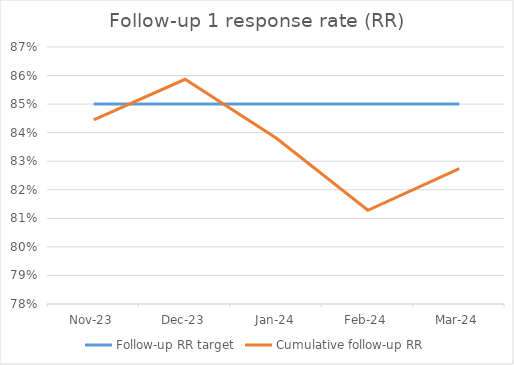
| Category | Follow-up RR target | Cumulative follow-up RR |
|---|---|---|
| Nov-23 | 0.85 | 0.844 |
| Dec-23 | 0.85 | 0.859 |
| Jan-24 | 0.85 | 0.838 |
| Feb-24 | 0.85 | 0.813 |
| Mar-24 | 0.85 | 0.827 |